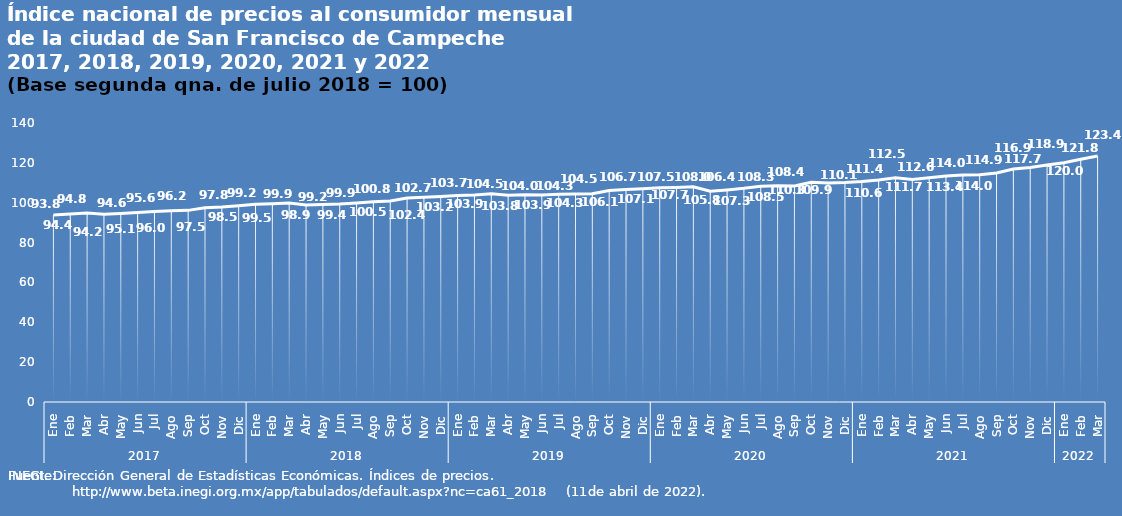
| Category | INPC |
|---|---|
| 0 | 93.796 |
| 1 | 94.381 |
| 2 | 94.793 |
| 3 | 94.159 |
| 4 | 94.574 |
| 5 | 95.127 |
| 6 | 95.562 |
| 7 | 95.953 |
| 8 | 96.161 |
| 9 | 97.483 |
| 10 | 97.83 |
| 11 | 98.483 |
| 12 | 99.179 |
| 13 | 99.526 |
| 14 | 99.888 |
| 15 | 98.873 |
| 16 | 99.155 |
| 17 | 99.409 |
| 18 | 99.883 |
| 19 | 100.462 |
| 20 | 100.815 |
| 21 | 102.353 |
| 22 | 102.711 |
| 23 | 103.161 |
| 24 | 103.675 |
| 25 | 103.918 |
| 26 | 104.504 |
| 27 | 103.794 |
| 28 | 104.01 |
| 29 | 103.929 |
| 30 | 104.288 |
| 31 | 104.315 |
| 32 | 104.455 |
| 33 | 106.137 |
| 34 | 106.687 |
| 35 | 107.064 |
| 36 | 107.495 |
| 37 | 107.678 |
| 38 | 107.995 |
| 39 | 105.766 |
| 40 | 106.423 |
| 41 | 107.259 |
| 42 | 108.287 |
| 43 | 108.471 |
| 44 | 108.418 |
| 45 | 110.311 |
| 46 | 109.889 |
| 47 | 110.111 |
| 48 | 110.602 |
| 49 | 111.411 |
| 50 | 112.498 |
| 51 | 111.695 |
| 52 | 112.563 |
| 53 | 113.407 |
| 54 | 113.953 |
| 55 | 114.036 |
| 56 | 114.891 |
| 57 | 116.903 |
| 58 | 117.714 |
| 59 | 118.879 |
| 60 | 120.044 |
| 61 | 121.763 |
| 62 | 123.402 |